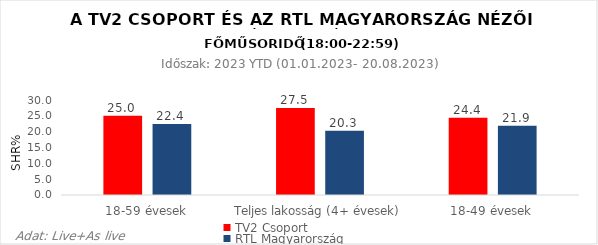
| Category | TV2 Csoport | RTL Magyarország |
|---|---|---|
| 18-59 évesek | 25 | 22.4 |
| Teljes lakosság (4+ évesek) | 27.5 | 20.3 |
| 18-49 évesek | 24.4 | 21.9 |